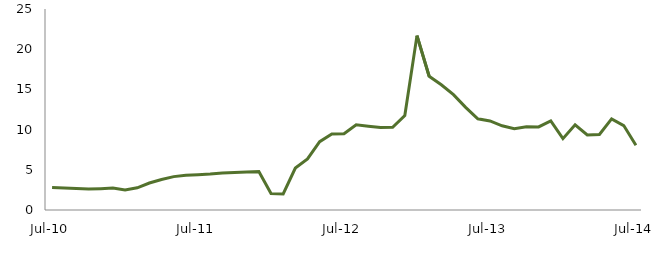
| Category | Series 0 |
|---|---|
| Jul-10 | 2.797 |
|  | 2.732 |
|  | 2.664 |
|  | 2.599 |
|  | 2.657 |
|  | 2.723 |
|  | 2.482 |
|  | 2.759 |
|  | 3.354 |
|  | 3.786 |
|  | 4.151 |
|  | 4.328 |
| Jul-11 | 4.398 |
|  | 4.464 |
|  | 4.588 |
|  | 4.679 |
|  | 4.725 |
|  | 4.771 |
|  | 2.048 |
|  | 1.991 |
|  | 5.225 |
|  | 6.354 |
|  | 8.497 |
|  | 9.463 |
| Jul-12 | 9.491 |
|  | 10.603 |
|  | 10.425 |
|  | 10.27 |
|  | 10.29 |
|  | 11.75 |
|  | 21.688 |
|  | 16.642 |
|  | 15.583 |
|  | 14.352 |
|  | 12.766 |
|  | 11.347 |
| Jul-13 | 11.081 |
|  | 10.473 |
|  | 10.123 |
|  | 10.344 |
|  | 10.337 |
|  | 11.09 |
|  | 8.878 |
|  | 10.595 |
|  | 9.33 |
|  | 9.398 |
|  | 11.339 |
|  | 10.501 |
| Jul-14 | 8.045 |